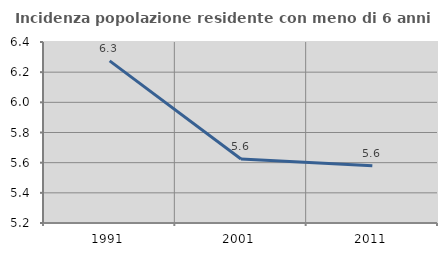
| Category | Incidenza popolazione residente con meno di 6 anni |
|---|---|
| 1991.0 | 6.275 |
| 2001.0 | 5.624 |
| 2011.0 | 5.579 |